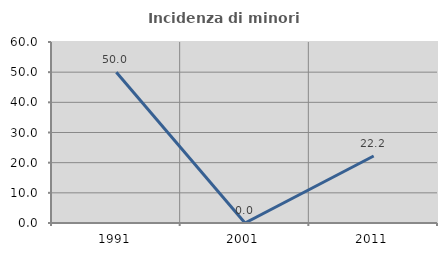
| Category | Incidenza di minori stranieri |
|---|---|
| 1991.0 | 50 |
| 2001.0 | 0 |
| 2011.0 | 22.222 |